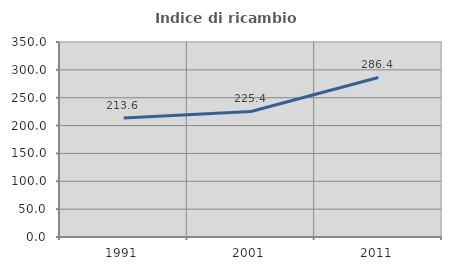
| Category | Indice di ricambio occupazionale  |
|---|---|
| 1991.0 | 213.636 |
| 2001.0 | 225.373 |
| 2011.0 | 286.364 |